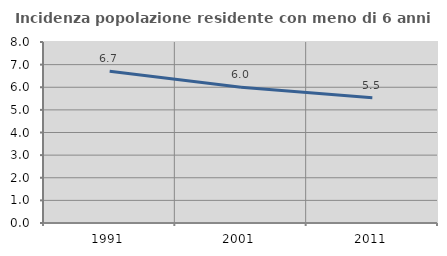
| Category | Incidenza popolazione residente con meno di 6 anni |
|---|---|
| 1991.0 | 6.708 |
| 2001.0 | 6.004 |
| 2011.0 | 5.534 |